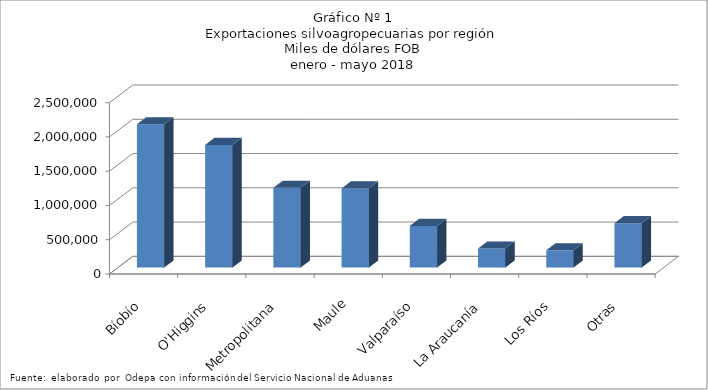
| Category | Series 0 |
|---|---|
| Bíobío | 2090980.81 |
| O'Higgins | 1789243.544 |
| Metropolitana | 1164943.04 |
| Maule | 1154566.971 |
| Valparaíso | 607597.673 |
| La Araucanía | 277701.736 |
| Los Ríos | 251075.829 |
| Otras | 647321.46 |